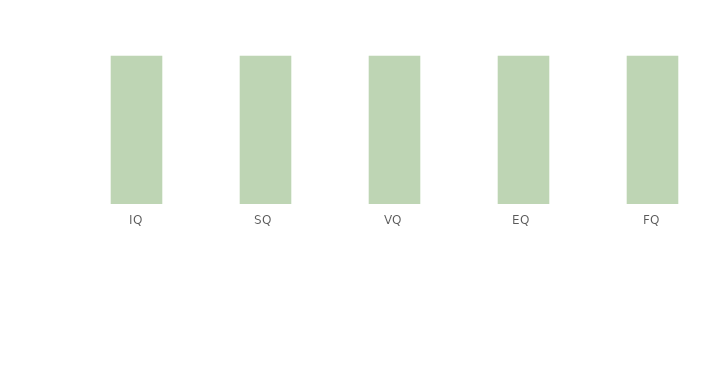
| Category | % | % verschil |
|---|---|---|
| IQ | 0 | 1 |
| SQ | 0 | 1 |
| VQ | 0 | 1 |
| EQ | 0 | 1 |
| FQ | 0 | 1 |